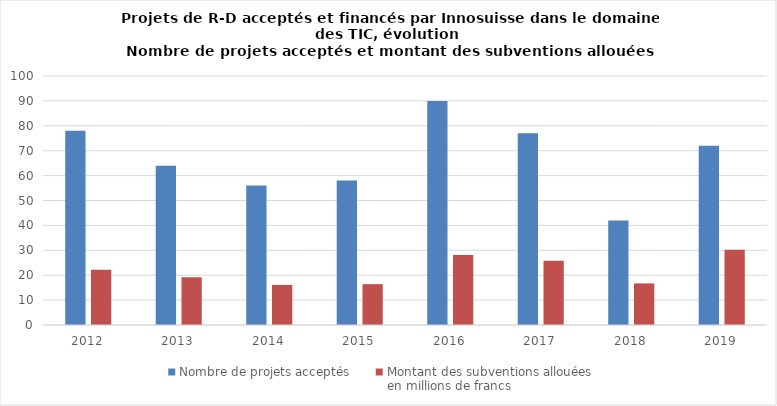
| Category | Nombre de projets acceptés  | Montant des subventions allouées 
en millions de francs |
|---|---|---|
| 2012.0 | 78 | 22.2 |
| 2013.0 | 64 | 19.2 |
| 2014.0 | 56 | 16.1 |
| 2015.0 | 58 | 16.4 |
| 2016.0 | 90 | 28.1 |
| 2017.0 | 77 | 25.8 |
| 2018.0 | 42 | 16.7 |
| 2019.0 | 72 | 30.2 |